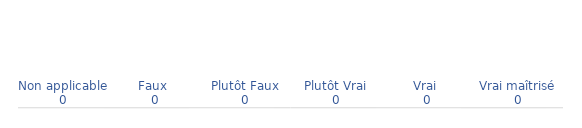
| Category | Niveaux Véracité Critères |
|---|---|
| Non applicable | 0 |
| Faux  | 0 |
| Plutôt Faux | 0 |
| Plutôt Vrai | 0 |
| Vrai  | 0 |
| Vrai maîtrisé | 0 |